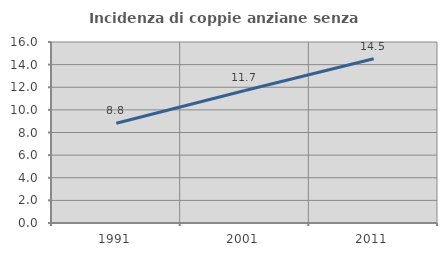
| Category | Incidenza di coppie anziane senza figli  |
|---|---|
| 1991.0 | 8.822 |
| 2001.0 | 11.719 |
| 2011.0 | 14.517 |